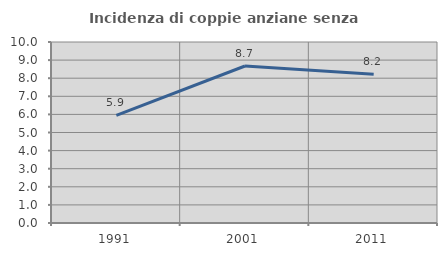
| Category | Incidenza di coppie anziane senza figli  |
|---|---|
| 1991.0 | 5.947 |
| 2001.0 | 8.675 |
| 2011.0 | 8.212 |